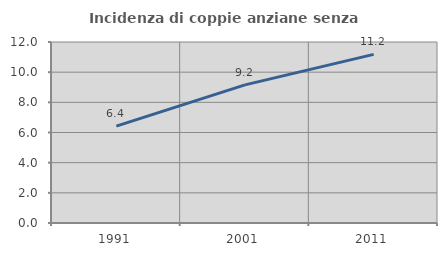
| Category | Incidenza di coppie anziane senza figli  |
|---|---|
| 1991.0 | 6.418 |
| 2001.0 | 9.155 |
| 2011.0 | 11.181 |